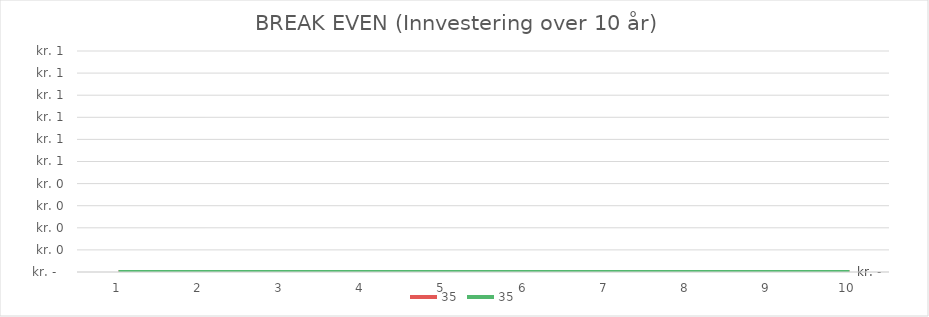
| Category | 35 | 19W Rax (on/off) | Løsning 2 |
|---|---|---|---|
| 0 | 0 |  |  |
| 1 | 0 |  |  |
| 2 | 0 |  |  |
| 3 | 0 |  |  |
| 4 | 0 |  |  |
| 5 | 0 |  |  |
| 6 | 0 |  |  |
| 7 | 0 |  |  |
| 8 | 0 |  |  |
| 9 | 0 |  |  |